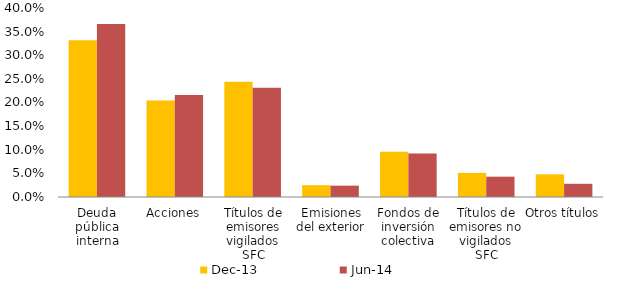
| Category | dic-13 | jun-14 |
|---|---|---|
| Deuda pública interna | 0.332 | 0.366 |
| Acciones | 0.204 | 0.216 |
| Títulos de emisores vigilados SFC | 0.244 | 0.231 |
| Emisiones del exterior | 0.025 | 0.024 |
| Fondos de inversión colectiva | 0.096 | 0.092 |
| Títulos de emisores no vigilados SFC | 0.051 | 0.043 |
| Otros títulos | 0.048 | 0.028 |